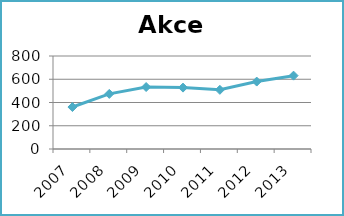
| Category | Akce |
|---|---|
| 2007.0 | 361 |
| 2008.0 | 474 |
| 2009.0 | 533 |
| 2010.0 | 528 |
| 2011.0 | 509 |
| 2012.0 | 580 |
| 2013.0 | 631 |